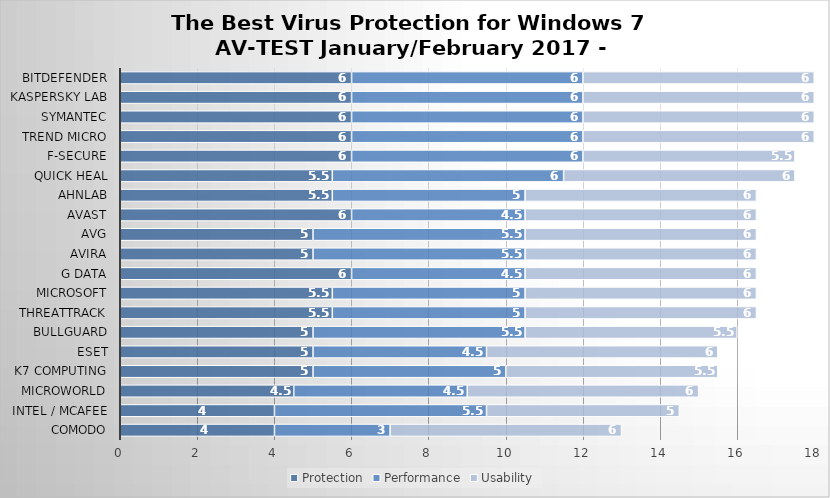
| Category | Protection | Performance | Usability |
|---|---|---|---|
| Comodo | 4 | 3 | 6 |
| Intel / McAfee | 4 | 5.5 | 5 |
| Microworld | 4.5 | 4.5 | 6 |
| K7 Computing | 5 | 5 | 5.5 |
| ESET | 5 | 4.5 | 6 |
| BullGuard | 5 | 5.5 | 5.5 |
| ThreatTrack | 5.5 | 5 | 6 |
| Microsoft | 5.5 | 5 | 6 |
| G Data | 6 | 4.5 | 6 |
| Avira | 5 | 5.5 | 6 |
| AVG | 5 | 5.5 | 6 |
| Avast | 6 | 4.5 | 6 |
| AhnLab | 5.5 | 5 | 6 |
| Quick Heal | 5.5 | 6 | 6 |
| F-Secure | 6 | 6 | 5.5 |
| Trend Micro | 6 | 6 | 6 |
| Symantec | 6 | 6 | 6 |
| Kaspersky Lab | 6 | 6 | 6 |
| Bitdefender | 6 | 6 | 6 |